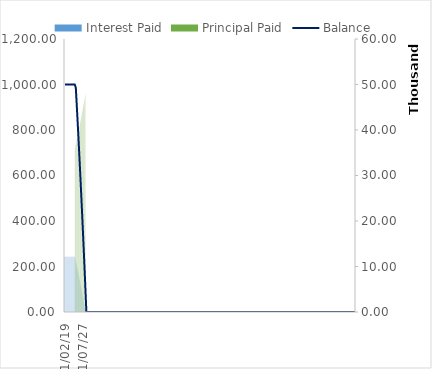
| Category | Interest Paid | Principal Paid |
|---|---|---|
| 01/02/19 | 243.378 | 0 |
| 01/03/19 | 243.378 | 0 |
| 01/04/19 | 243.378 | 0 |
| 01/05/19 | 243.378 | 0 |
| 01/06/19 | 243.378 | 0 |
| 01/07/19 | 243.378 | 0 |
| 01/08/19 | 243.378 | 0 |
| 01/09/19 | 243.378 | 0 |
| 01/10/19 | 243.378 | 0 |
| 01/11/19 | 243.378 | 0 |
| 01/12/19 | 243.378 | 0 |
| 01/01/20 | 243.378 | 0 |
| 01/02/20 | 243.378 | 0 |
| 01/03/20 | 243.378 | 0 |
| 01/04/20 | 243.378 | 0 |
| 01/05/20 | 243.378 | 0 |
| 01/06/20 | 243.378 | 0 |
| 01/07/20 | 243.378 | 0 |
| 01/08/20 | 243.378 | 0 |
| 01/09/20 | 243.378 | 0 |
| 01/10/20 | 243.378 | 0 |
| 01/11/20 | 243.378 | 0 |
| 01/12/20 | 243.378 | 0 |
| 01/01/21 | 243.378 | 0 |
| 01/02/21 | 243.378 | 0 |
| 01/03/21 | 243.378 | 0 |
| 01/04/21 | 243.378 | 0 |
| 01/05/21 | 243.378 | 0 |
| 01/06/21 | 243.378 | 0 |
| 01/07/21 | 243.378 | 0 |
| 01/08/21 | 243.378 | 0 |
| 01/09/21 | 243.378 | 0 |
| 01/10/21 | 243.378 | 0 |
| 01/11/21 | 243.378 | 0 |
| 01/12/21 | 243.378 | 0 |
| 01/01/22 | 243.378 | 0 |
| 01/02/22 | 243.378 | 0 |
| 01/03/22 | 243.378 | 0 |
| 01/04/22 | 243.378 | 0 |
| 01/05/22 | 243.378 | 0 |
| 01/06/22 | 243.378 | 0 |
| 01/07/22 | 243.378 | 0 |
| 01/08/22 | 243.378 | 0 |
| 01/09/22 | 243.378 | 0 |
| 01/10/22 | 243.378 | 0 |
| 01/11/22 | 243.378 | 0 |
| 01/12/22 | 243.378 | 0 |
| 01/01/23 | 243.378 | 0 |
| 01/02/23 | 243.378 | 0 |
| 01/03/23 | 243.378 | 0 |
| 01/04/23 | 243.378 | 0 |
| 01/05/23 | 243.378 | 0 |
| 01/06/23 | 243.378 | 0 |
| 01/07/23 | 243.378 | 0 |
| 01/08/23 | 243.378 | 0 |
| 01/09/23 | 243.378 | 0 |
| 01/10/23 | 243.378 | 0 |
| 01/11/23 | 243.378 | 0 |
| 01/12/23 | 243.378 | 0 |
| 01/01/24 | 243.378 | 0 |
| 01/02/24 | 243.378 | 719.572 |
| 01/03/24 | 239.875 | 723.074 |
| 01/04/24 | 236.355 | 726.594 |
| 01/05/24 | 232.819 | 730.131 |
| 01/06/24 | 229.265 | 733.684 |
| 01/07/24 | 225.693 | 737.256 |
| 01/08/24 | 222.105 | 740.844 |
| 01/09/24 | 218.499 | 744.45 |
| 01/10/24 | 214.875 | 748.074 |
| 01/11/24 | 211.234 | 751.715 |
| 01/12/24 | 207.575 | 755.374 |
| 01/01/25 | 203.898 | 759.051 |
| 01/02/25 | 200.203 | 762.746 |
| 01/03/25 | 196.491 | 766.459 |
| 01/04/25 | 192.76 | 770.189 |
| 01/05/25 | 189.011 | 773.938 |
| 01/06/25 | 185.244 | 777.706 |
| 01/07/25 | 181.458 | 781.491 |
| 01/08/25 | 177.654 | 785.295 |
| 01/09/25 | 173.832 | 789.117 |
| 01/10/25 | 169.991 | 792.959 |
| 01/11/25 | 166.131 | 796.818 |
| 01/12/25 | 162.252 | 800.697 |
| 01/01/26 | 158.355 | 804.594 |
| 01/02/26 | 154.438 | 808.511 |
| 01/03/26 | 150.503 | 812.446 |
| 01/04/26 | 146.548 | 816.401 |
| 01/05/26 | 142.575 | 820.375 |
| 01/06/26 | 138.581 | 824.368 |
| 01/07/26 | 134.569 | 828.381 |
| 01/08/26 | 130.536 | 832.413 |
| 01/09/26 | 126.485 | 836.465 |
| 01/10/26 | 122.413 | 840.536 |
| 01/11/26 | 118.322 | 844.627 |
| 01/12/26 | 114.211 | 848.739 |
| 01/01/27 | 110.079 | 852.87 |
| 01/02/27 | 105.928 | 857.021 |
| 01/03/27 | 101.756 | 861.193 |
| 01/04/27 | 97.564 | 865.385 |
| 01/05/27 | 93.352 | 869.597 |
| 01/06/27 | 89.119 | 873.83 |
| 01/07/27 | 84.866 | 878.083 |
| 01/08/27 | 80.592 | 882.357 |
| 01/09/27 | 76.297 | 886.652 |
| 01/10/27 | 71.981 | 890.968 |
| 01/11/27 | 67.644 | 895.305 |
| 01/12/27 | 63.286 | 899.663 |
| 01/01/28 | 58.907 | 904.042 |
| 01/02/28 | 54.507 | 908.443 |
| 01/03/28 | 50.085 | 912.864 |
| 01/04/28 | 45.641 | 917.308 |
| 01/05/28 | 41.176 | 921.773 |
| 01/06/28 | 36.689 | 926.26 |
| 01/07/28 | 32.181 | 930.768 |
| 01/08/28 | 27.65 | 935.299 |
| 01/09/28 | 23.098 | 939.852 |
| 01/10/28 | 18.523 | 944.426 |
| 01/11/28 | 13.926 | 949.023 |
| 01/12/28 | 9.306 | 953.643 |
| 01/01/29 | 4.664 | 958.285 |